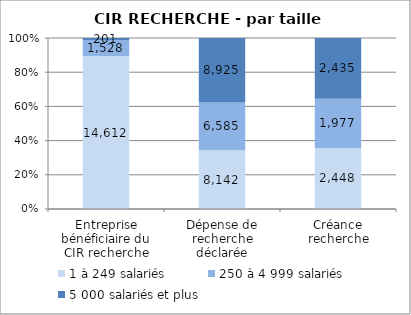
| Category | 1 à 249 salariés | 250 à 4 999 salariés | 5 000 salariés et plus |
|---|---|---|---|
| Entreprise bénéficiaire du CIR recherche | 14612 | 1528 | 201 |
| Dépense de recherche déclarée | 8142.09 | 6584.5 | 8925.36 |
| Créance recherche | 2447.52 | 1976.92 | 2435.02 |